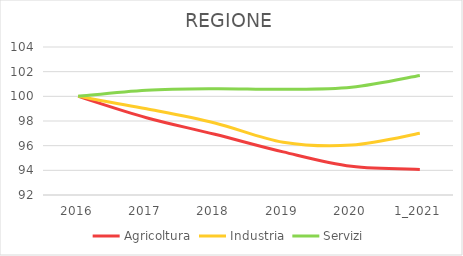
| Category | Agricoltura | Industria | Servizi |
|---|---|---|---|
| 2016 | 100 | 100 | 100 |
| 2017 | 98.267 | 98.99 | 100.498 |
| 2018 | 96.926 | 97.844 | 100.615 |
| 2019 | 95.494 | 96.282 | 100.572 |
| 2020 | 94.322 | 96.047 | 100.741 |
| 1_2021 | 94.076 | 96.999 | 101.691 |